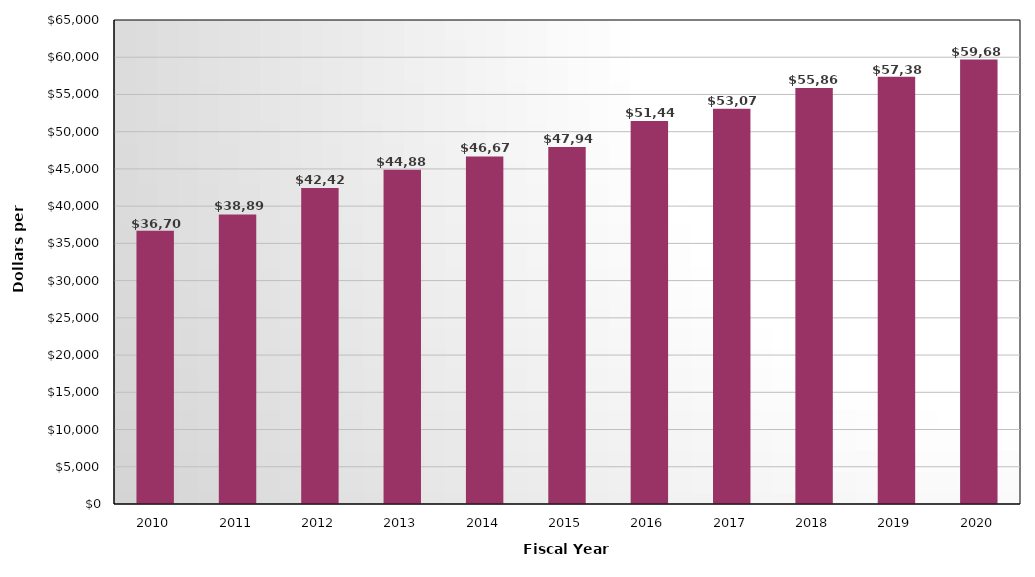
| Category | Tuition and Fees |
|---|---|
| 2010.0 | 36702 |
| 2011.0 | 38890 |
| 2012.0 | 42429 |
| 2013.0 | 44889 |
| 2014.0 | 46676 |
| 2015.0 | 47947 |
| 2016.0 | 51449 |
| 2017.0 | 53072 |
| 2018.0 | 55860 |
| 2019.0 | 57384 |
| 2020.0 | 59686 |